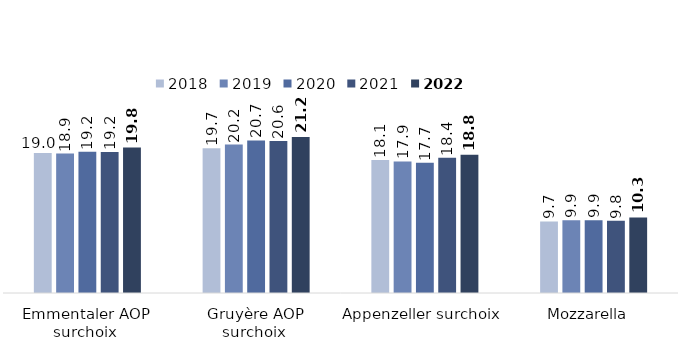
| Category | 2018 | 2019 | 2020 | 2021 | 2022 |
|---|---|---|---|---|---|
| Emmentaler AOP surchoix  | 19.027 | 18.94 | 19.186 | 19.151 | 19.768 |
| Gruyère AOP surchoix  | 19.684 | 20.175 | 20.727 | 20.644 | 21.198 |
| Appenzeller surchoix  | 18.08 | 17.874 | 17.714 | 18.375 | 18.768 |
| Mozzarella  | 9.727 | 9.869 | 9.874 | 9.814 | 10.267 |